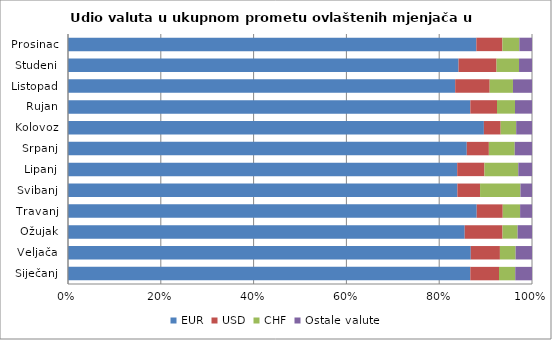
| Category | EUR | USD | CHF | Ostale valute |
|---|---|---|---|---|
| Siječanj | 86.707 | 6.178 | 3.505 | 3.61 |
| Veljača | 86.802 | 6.282 | 3.382 | 3.533 |
| Ožujak | 85.497 | 8.15 | 3.257 | 3.097 |
| Travanj | 88.085 | 5.609 | 3.743 | 2.563 |
| Svibanj | 83.923 | 4.885 | 8.703 | 2.489 |
| Lipanj | 83.88 | 5.868 | 7.302 | 2.95 |
| Srpanj | 85.943 | 4.761 | 5.569 | 3.727 |
| Kolovoz | 89.631 | 3.616 | 3.345 | 3.408 |
| Rujan | 86.71 | 5.749 | 3.872 | 3.669 |
| Listopad | 83.448 | 7.435 | 5.015 | 4.103 |
| Studeni | 84.171 | 8.187 | 4.848 | 2.794 |
| Prosinac | 88.005 | 5.616 | 3.651 | 2.727 |